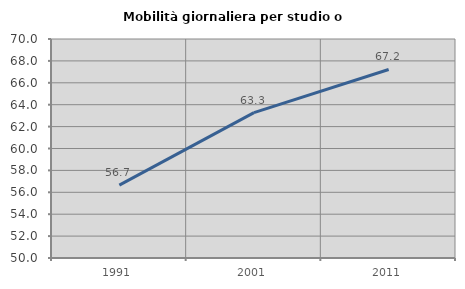
| Category | Mobilità giornaliera per studio o lavoro |
|---|---|
| 1991.0 | 56.654 |
| 2001.0 | 63.275 |
| 2011.0 | 67.216 |